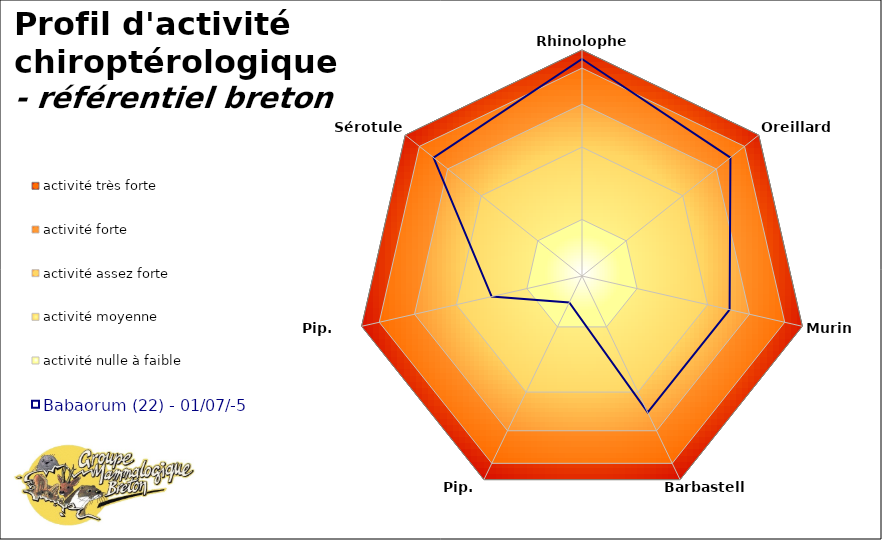
| Category | activité très forte | activité forte | activité assez forte | activité moyenne | activité nulle à faible | 0 | Babaorum (22) - 01/07/-50 |
|---|---|---|---|---|---|---|---|
| Rhinolophes | 100 | 92 | 76 | 57 | 25 | 0 | 96 |
| Oreillards | 100 | 92 | 76 | 57 | 25 | 0 | 84 |
| Murins | 100 | 92 | 76 | 57 | 25 | 0 | 67 |
| Barbastelle | 100 | 92 | 76 | 57 | 25 | 0 | 67 |
| Pip. hautes | 100 | 92 | 76 | 57 | 25 | 0 | 13 |
| Pip. basses | 100 | 92 | 76 | 57 | 25 | 0 | 41 |
| Sérotules | 100 | 92 | 76 | 57 | 25 | 0 | 84 |